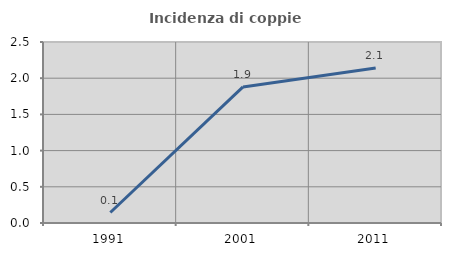
| Category | Incidenza di coppie miste |
|---|---|
| 1991.0 | 0.145 |
| 2001.0 | 1.88 |
| 2011.0 | 2.14 |